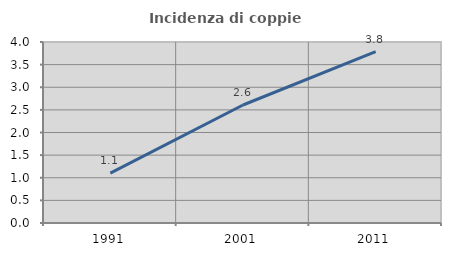
| Category | Incidenza di coppie miste |
|---|---|
| 1991.0 | 1.102 |
| 2001.0 | 2.608 |
| 2011.0 | 3.789 |